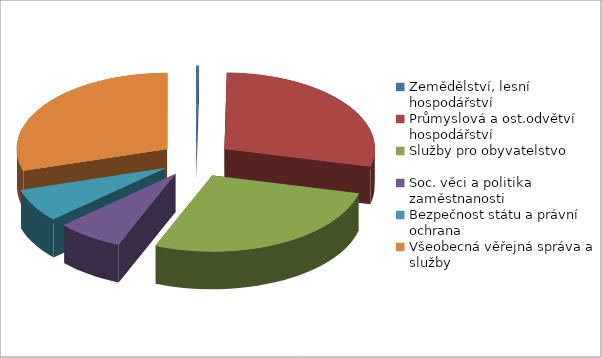
| Category | Series 0 |
|---|---|
| Zemědělství, lesní hospodářství | 17596 |
| Průmyslová a ost.odvětví hospodářství | 1982177 |
| Služby pro obyvatelstvo | 1905532 |
| Soc. věci a politika zaměstnanosti | 492942 |
| Bezpečnost státu a právní ochrana | 490560 |
| Všeobecná věřejná správa a služby | 2064565 |